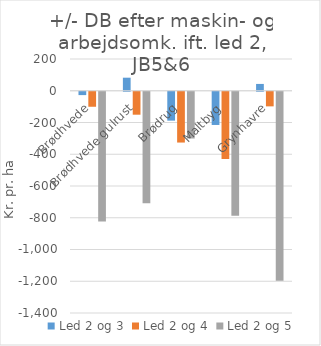
| Category | Led 2 og 3 | Led 2 og 4 | Led 2 og 5 |
|---|---|---|---|
| Brødhvede | -21.1 | -94.55 | -816.7 |
| Brødhvede gulrust | 82.25 | -144.6 | -702.3 |
| Brødrug | -182 | -320 | -294.6 |
| Maltbyg | -209.25 | -423.75 | -781 |
| Grynhavre | 42.95 | -92.05 | -1190.9 |